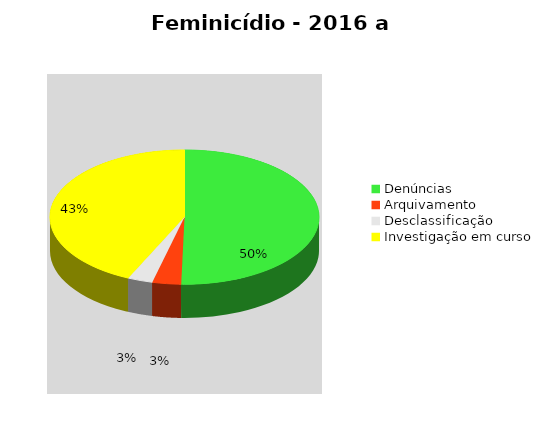
| Category | Series 0 |
|---|---|
| Denúncias | 1474 |
| Arquivamento | 101 |
| Desclassificação | 88 |
| Investigação em curso | 1262 |